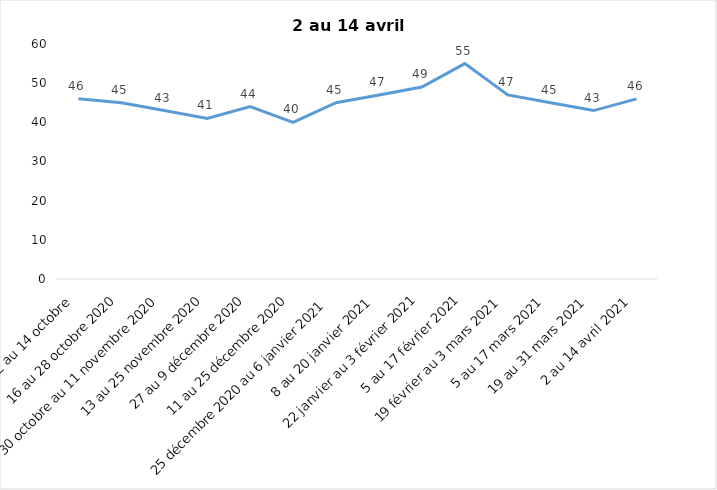
| Category | Toujours aux trois mesures |
|---|---|
| 2 au 14 octobre  | 46 |
| 16 au 28 octobre 2020 | 45 |
| 30 octobre au 11 novembre 2020 | 43 |
| 13 au 25 novembre 2020 | 41 |
| 27 au 9 décembre 2020 | 44 |
| 11 au 25 décembre 2020 | 40 |
| 25 décembre 2020 au 6 janvier 2021 | 45 |
| 8 au 20 janvier 2021 | 47 |
| 22 janvier au 3 février 2021 | 49 |
| 5 au 17 février 2021 | 55 |
| 19 février au 3 mars 2021 | 47 |
| 5 au 17 mars 2021 | 45 |
| 19 au 31 mars 2021 | 43 |
| 2 au 14 avril 2021 | 46 |